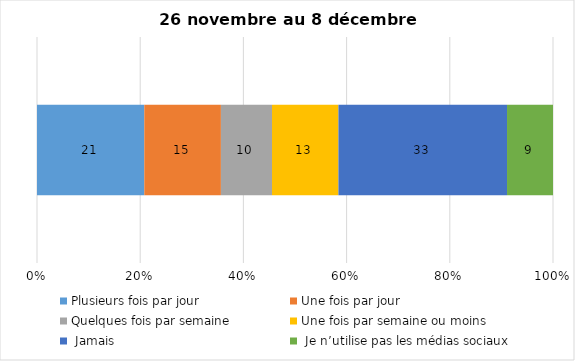
| Category | Plusieurs fois par jour | Une fois par jour | Quelques fois par semaine   | Une fois par semaine ou moins   |  Jamais   |  Je n’utilise pas les médias sociaux |
|---|---|---|---|---|---|---|
| 0 | 21 | 15 | 10 | 13 | 33 | 9 |